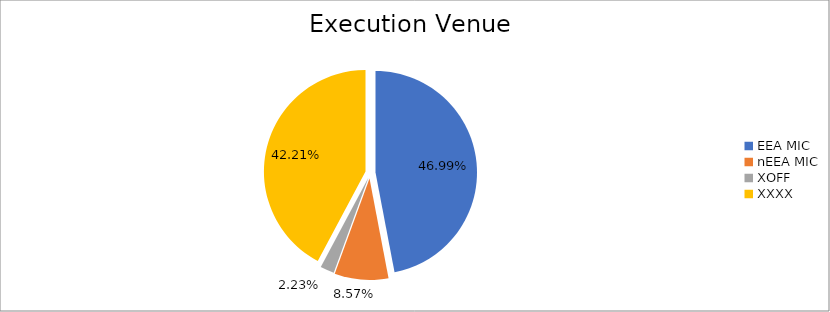
| Category | Series 0 |
|---|---|
| EEA MIC | 4575909.082 |
| nEEA MIC | 834629.862 |
| XOFF | 216677.689 |
| XXXX | 4110171.338 |